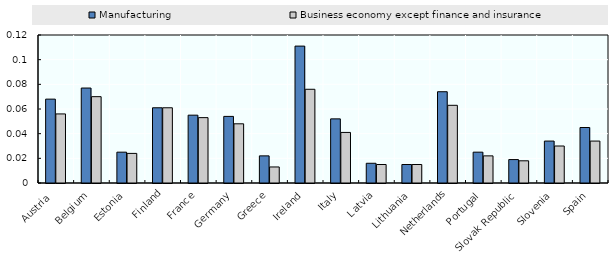
| Category | Manufacturing | Business economy except finance and insurance |
|---|---|---|
| Austria  | 0.068 | 0.056 |
| Belgium | 0.077 | 0.07 |
| Estonia | 0.025 | 0.024 |
| Finland | 0.061 | 0.061 |
| France | 0.055 | 0.053 |
| Germany | 0.054 | 0.048 |
| Greece | 0.022 | 0.013 |
| Ireland | 0.111 | 0.076 |
| Italy | 0.052 | 0.041 |
| Latvia | 0.016 | 0.015 |
| Lithuania | 0.015 | 0.015 |
| Netherlands | 0.074 | 0.063 |
| Portugal | 0.025 | 0.022 |
| Slovak Republic | 0.019 | 0.018 |
| Slovenia | 0.034 | 0.03 |
| Spain | 0.045 | 0.034 |